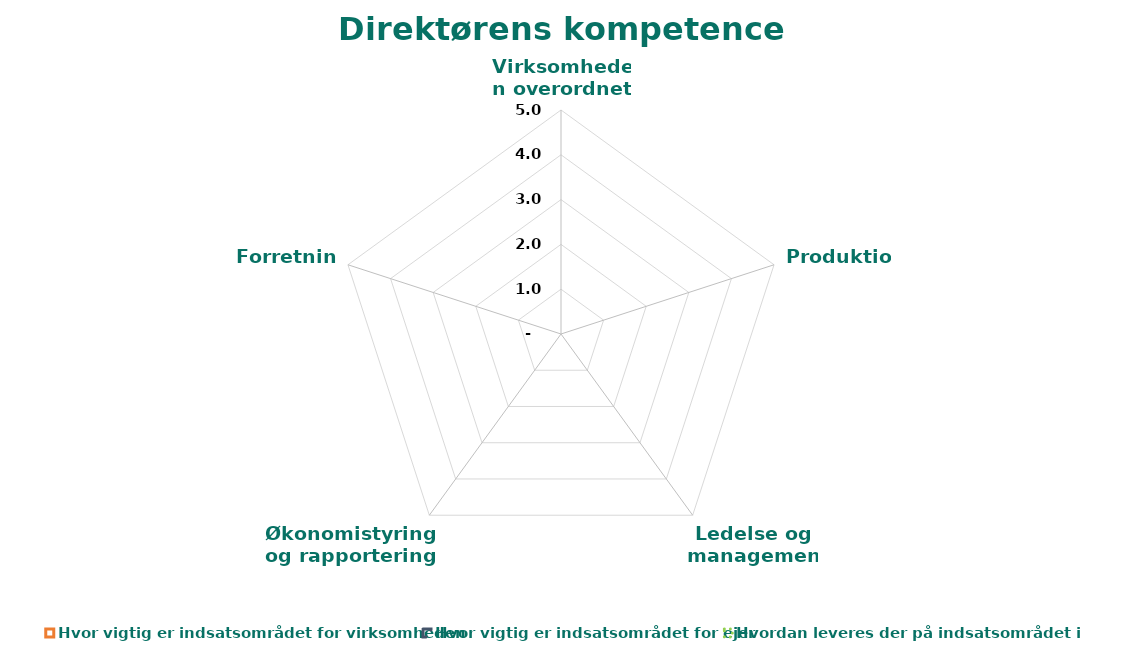
| Category | Hvor vigtig er indsatsområdet for virksomheden | Hvor vigtig er indsatsområdet for ejer | Hvordan leveres der på indsatsområdet i dag |
|---|---|---|---|
| Virksomheden overordnet | 0 | 0 | 0 |
| Produktion | 0 | 0 | 0 |
| Ledelse og management | 0 | 0 | 0 |
| Økonomistyring og rapportering | 0 | 0 | 0 |
| Forretning | 0 | 0 | 0 |